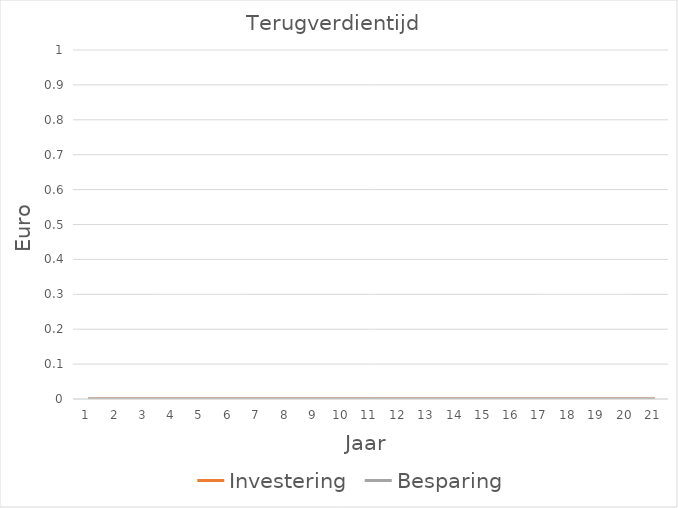
| Category | Investering | Besparing |
|---|---|---|
| 0 | 0 | 0 |
| 1 | 0 | 0 |
| 2 | 0 | 0 |
| 3 | 0 | 0 |
| 4 | 0 | 0 |
| 5 | 0 | 0 |
| 6 | 0 | 0 |
| 7 | 0 | 0 |
| 8 | 0 | 0 |
| 9 | 0 | 0 |
| 10 | 0 | 0 |
| 11 | 0 | 0 |
| 12 | 0 | 0 |
| 13 | 0 | 0 |
| 14 | 0 | 0 |
| 15 | 0 | 0 |
| 16 | 0 | 0 |
| 17 | 0 | 0 |
| 18 | 0 | 0 |
| 19 | 0 | 0 |
| 20 | 0 | 0 |